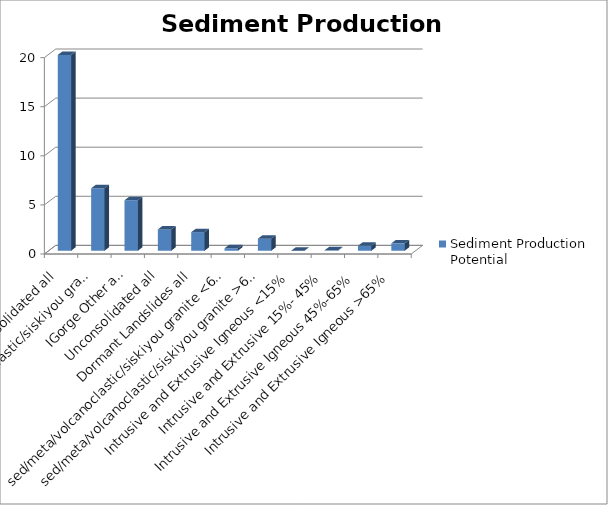
| Category | Sediment Production Potential |
|---|---|
| IGorge Unconsolidated all | 19.94 |
| IGorge sed/meta/volcanoclastic/siskiyou granite all | 6.36 |
| IGorge Other all | 5.14 |
| Unconsolidated all | 2.17 |
| Dormant Landslides all | 1.89 |
| sed/meta/volcanoclastic/siskiyou granite <65% | 0.25 |
| sed/meta/volcanoclastic/siskiyou granite >65% | 1.23 |
| Intrusive and Extrusive Igneous <15% | 0.01 |
| Intrusive and Extrusive 15%- 45% | 0.05 |
| Intrusive and Extrusive Igneous 45%-65% | 0.5 |
| Intrusive and Extrusive Igneous >65% | 0.75 |